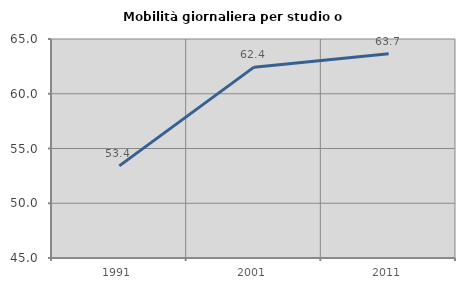
| Category | Mobilità giornaliera per studio o lavoro |
|---|---|
| 1991.0 | 53.414 |
| 2001.0 | 62.428 |
| 2011.0 | 63.656 |